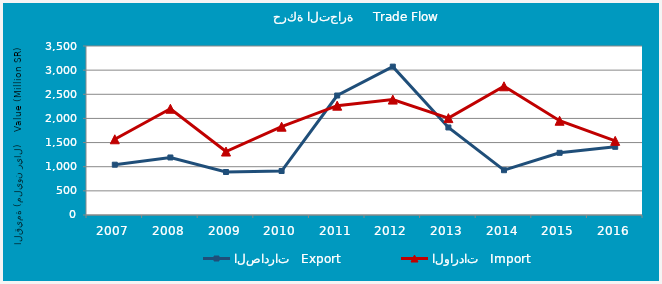
| Category | الصادرات   Export | الواردات   Import |
|---|---|---|
| 2007.0 | 1041.845 | 1568.377 |
| 2008.0 | 1191.237 | 2200.134 |
| 2009.0 | 890.366 | 1314.2 |
| 2010.0 | 910.925 | 1828.92 |
| 2011.0 | 2474.21 | 2263.901 |
| 2012.0 | 3073.028 | 2389.752 |
| 2013.0 | 1812.873 | 2006.57 |
| 2014.0 | 927.655 | 2665.625 |
| 2015.0 | 1287.826 | 1951.925 |
| 2016.0 | 1412.093 | 1535.659 |